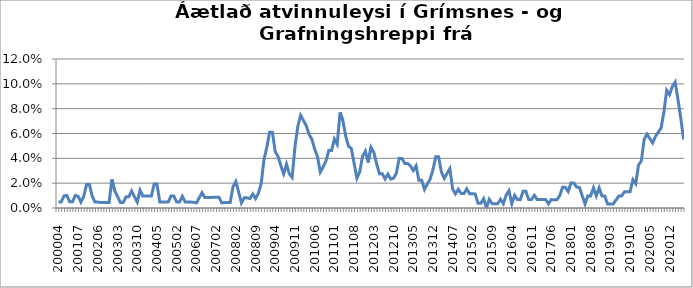
| Category | Series 0 |
|---|---|
| 200004 | 0.005 |
| 200005 | 0.005 |
| 200006 | 0.01 |
| 200007 | 0.01 |
| 200011 | 0.005 |
| 200012 | 0.005 |
| 200106 | 0.01 |
| 200107 | 0.009 |
| 200108 | 0.005 |
| 200112 | 0.009 |
| 200201 | 0.019 |
| 200202 | 0.019 |
| 200203 | 0.009 |
| 200204 | 0.005 |
| 200206 | 0.005 |
| 200207 | 0.004 |
| 200210 | 0.004 |
| 200211 | 0.004 |
| 200212 | 0.004 |
| 200301 | 0.023 |
| 200302 | 0.014 |
| 200303 | 0.009 |
| 200304 | 0.004 |
| 200305 | 0.004 |
| 200306 | 0.009 |
| 200307 | 0.009 |
| 200308 | 0.014 |
| 200309 | 0.009 |
| 200310 | 0.005 |
| 200311 | 0.014 |
| 200312 | 0.01 |
| 200401 | 0.01 |
| 200402 | 0.01 |
| 200403 | 0.01 |
| 200404 | 0.019 |
| 200405 | 0.019 |
| 200406 | 0.005 |
| 200409 | 0.005 |
| 200410 | 0.005 |
| 200411 | 0.005 |
| 200412 | 0.01 |
| 200501 | 0.01 |
| 200502 | 0.005 |
| 200503 | 0.005 |
| 200504 | 0.009 |
| 200512 | 0.005 |
| 200602 | 0.005 |
| 200603 | 0.005 |
| 200606 | 0.005 |
| 200607 | 0.004 |
| 200608 | 0.008 |
| 200609 | 0.012 |
| 200610 | 0.009 |
| 200611 | 0.009 |
| 200612 | 0.009 |
| 200701 | 0.009 |
| 200702 | 0.009 |
| 200703 | 0.009 |
| 200704 | 0.004 |
| 200710 | 0.004 |
| 200711 | 0.004 |
| 200712 | 0.004 |
| 200801 | 0.017 |
| 200802 | 0.021 |
| 200803 | 0.013 |
| 200804 | 0.004 |
| 200805 | 0.008 |
| 200806 | 0.008 |
| 200807 | 0.008 |
| 200808 | 0.011 |
| 200809 | 0.008 |
| 200810 | 0.012 |
| 200811 | 0.02 |
| 200812 | 0.039 |
| 200901 | 0.049 |
| 200902 | 0.061 |
| 200903 | 0.061 |
| 200904 | 0.045 |
| 200905 | 0.042 |
| 200906 | 0.034 |
| 200907 | 0.027 |
| 200908 | 0.035 |
| 200909 | 0.027 |
| 200910 | 0.025 |
| 200911 | 0.049 |
| 200912 | 0.066 |
| 201001 | 0.075 |
| 201002 | 0.071 |
| 201003 | 0.066 |
| 201004 | 0.059 |
| 201005 | 0.055 |
| 201006 | 0.047 |
| 201007 | 0.041 |
| 201008 | 0.029 |
| 201009 | 0.033 |
| 201010 | 0.038 |
| 201011 | 0.046 |
| 201012 | 0.046 |
| 201101 | 0.056 |
| 201102 | 0.051 |
| 201103 | 0.077 |
| 201104 | 0.071 |
| 201105 | 0.058 |
| 201106 | 0.05 |
| 201107 | 0.048 |
| 201108 | 0.036 |
| 201109 | 0.024 |
| 201110 | 0.029 |
| 201111 | 0.042 |
| 201112 | 0.046 |
| 201201 | 0.037 |
| 201202 | 0.049 |
| 201203 | 0.045 |
| 201204 | 0.036 |
| 201205 | 0.028 |
| 201206 | 0.028 |
| 201207 | 0.023 |
| 201208 | 0.027 |
| 201209 | 0.023 |
| 201210 | 0.024 |
| 201211 | 0.028 |
| 201212 | 0.04 |
| 201301 | 0.04 |
| 201302 | 0.036 |
| 201303 | 0.036 |
| 201304 | 0.034 |
| 201305 | 0.03 |
| 201306 | 0.034 |
| 201307 | 0.022 |
| 201308 | 0.022 |
| 201309 | 0.015 |
| 201310 | 0.019 |
| 201311 | 0.023 |
| 201312 | 0.031 |
| 201401 | 0.041 |
| 201402 | 0.041 |
| 201403 | 0.029 |
| 201404 | 0.024 |
| 201405 | 0.028 |
| 201406 | 0.032 |
| 201407 | 0.015 |
| 201408 | 0.011 |
| 201409 | 0.015 |
| 201410 | 0.012 |
| 201411 | 0.012 |
| 201412 | 0.015 |
| 201501 | 0.012 |
| 201502 | 0.012 |
| 201503 | 0.011 |
| 201504 | 0.004 |
| 201505 | 0.004 |
| 201506 | 0.007 |
| 201507 | 0 |
| 201508 | 0.007 |
| 201509 | 0.004 |
| 201510 | 0.003 |
| 201511 | 0.003 |
| 201512 | 0.007 |
| 201601 | 0.003 |
| 201602 | 0.01 |
| 201603 | 0.014 |
| 201604 | 0.003 |
| 201605 | 0.01 |
| 201606 | 0.007 |
| 201607 | 0.007 |
| 201608 | 0.013 |
| 201609 | 0.013 |
| 201610 | 0.007 |
| 201611 | 0.007 |
| 201612 | 0.01 |
| 201701 | 0.007 |
| 201702 | 0.007 |
| 201703 | 0.007 |
| 201704 | 0.007 |
| 201705 | 0.003 |
| 201706 | 0.007 |
| 201707 | 0.007 |
| 201708 | 0.007 |
| 201709 | 0.01 |
| 201710 | 0.017 |
| 201711 | 0.017 |
| 201712 | 0.013 |
| 201801 | 0.02 |
| 201802 | 0.02 |
| 201803 | 0.017 |
| 201804 | 0.017 |
| 201805 | 0.01 |
| 201806 | 0.003 |
| 201807 | 0.01 |
| 201808 | 0.01 |
| 201809 | 0.016 |
| 201810 | 0.01 |
| 201811 | 0.016 |
| 201812 | 0.01 |
| 201901 | 0.01 |
| 201902 | 0.003 |
| 201903 | 0.003 |
| 201904 | 0.003 |
| 201905 | 0.006 |
| 201906 | 0.01 |
| 201907 | 0.01 |
| 201908 | 0.013 |
| 201909 | 0.013 |
| 201910 | 0.013 |
| 201911 | 0.023 |
| 201912 | 0.02 |
| 202001 | 0.035 |
| 202002 | 0.038 |
| 202003 | 0.055 |
| 202004 | 0.059 |
| 202005 | 0.056 |
| 202006 | 0.052 |
| 202007 | 0.058 |
| 202008 | 0.061 |
| 202009 | 0.064 |
| 202010 | 0.077 |
| 202011 | 0.095 |
| 202012 | 0.091 |
| 202101 | 0.098 |
| 202102 | 0.101 |
| 202103 | 0.087 |
| 202104 | 0.072 |
| 202105 | 0.055 |